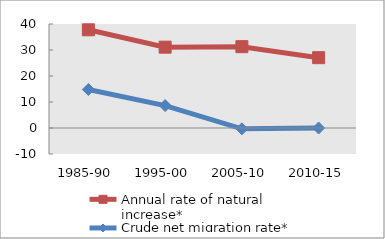
| Category | Annual rate of natural increase* | Crude net migration rate* |
|---|---|---|
| 1985-90 | 37.765 | 14.823 |
| 1995-00 | 31.091 | 8.624 |
| 2005-10 | 31.278 | -0.319 |
| 2010-15 | 27.047 | 0 |